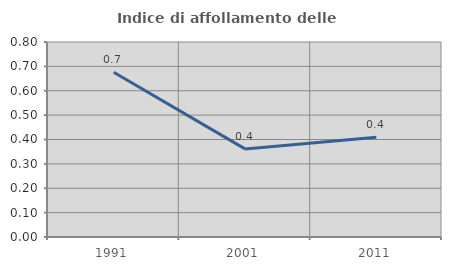
| Category | Indice di affollamento delle abitazioni  |
|---|---|
| 1991.0 | 0.676 |
| 2001.0 | 0.361 |
| 2011.0 | 0.409 |